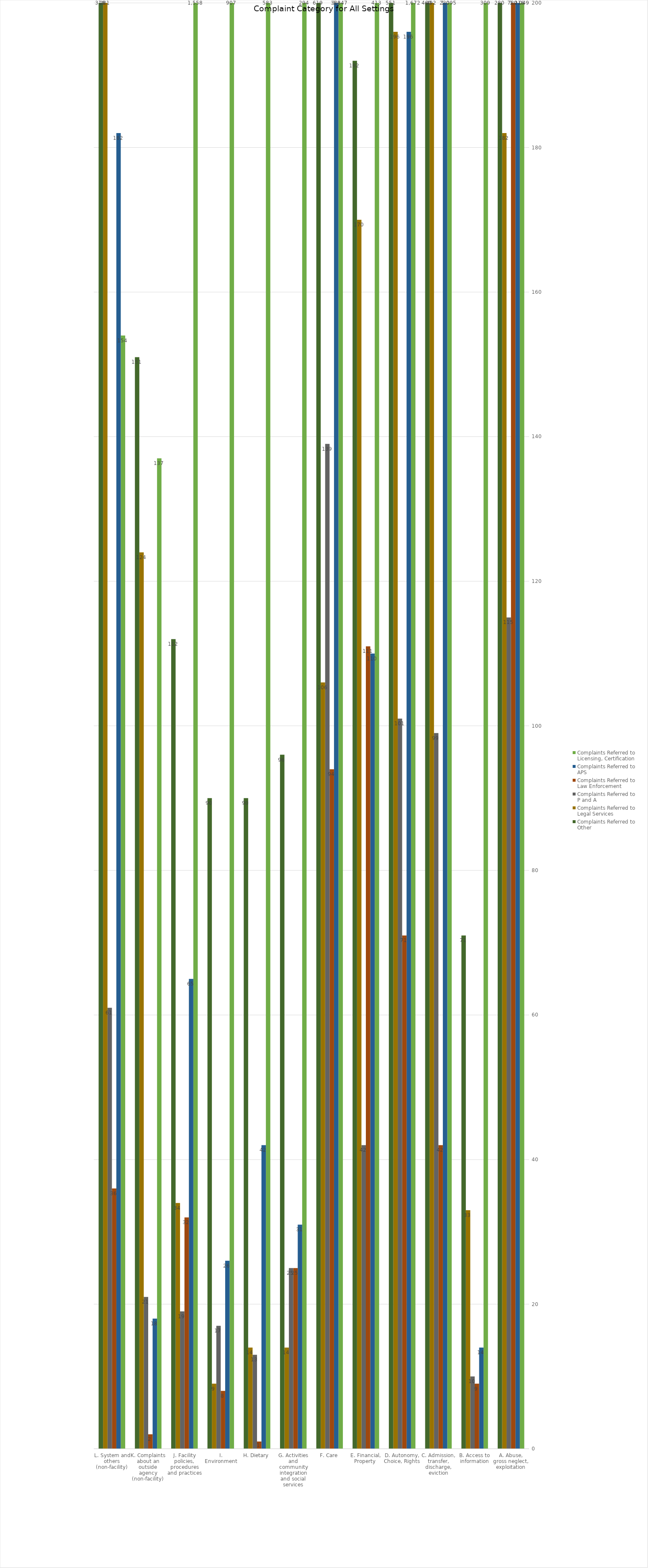
| Category | Complaints Referred to 
Licensing, Certification  | Complaints Referred to 
APS | Complaints Referred to 
Law Enforcement | Complaints Referred to 
P and A | Complaints Referred to 
Legal Services | Complaints Referred to 
Other |
|---|---|---|---|---|---|---|
| A. Abuse, gross neglect, exploitation | 2049 | 1216 | 780 | 115 | 182 | 280 |
| B. Access to information | 309 | 14 | 9 | 10 | 33 | 71 |
| C. Admission, transfer, discharge, eviction | 1095 | 230 | 42 | 99 | 492 | 460 |
| D. Autonomy, Choice, Rights | 1672 | 196 | 71 | 101 | 196 | 551 |
| E. Financial, Property  | 413 | 110 | 111 | 42 | 170 | 192 |
| F. Care | 3647 | 382 | 94 | 139 | 106 | 619 |
| G. Activities and community integration and social services | 294 | 31 | 25 | 25 | 14 | 96 |
| H. Dietary | 583 | 42 | 1 | 13 | 14 | 90 |
| I. Environment | 907 | 26 | 8 | 17 | 9 | 90 |
| J. Facility policies, procedures and practices | 1558 | 65 | 32 | 19 | 34 | 112 |
| K. Complaints about an outside agency (non-facility) | 137 | 18 | 2 | 21 | 124 | 151 |
| L. System and others (non-facility) | 154 | 182 | 36 | 61 | 281 | 318 |